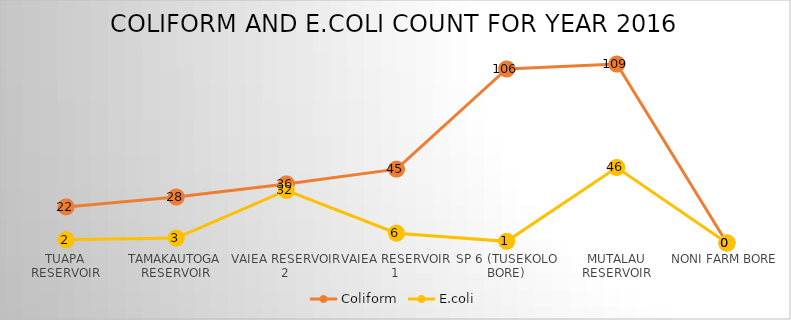
| Category | Coliform | E.coli |
|---|---|---|
| Tuapa Reservoir | 22 | 2 |
| Tamakautoga Reservoir | 28 | 3 |
| Vaiea Reservoir 2 | 36 | 32 |
| Vaiea Reservoir 1 | 45 | 6 |
| SP 6 (Tusekolo Bore) | 106 | 1 |
| Mutalau Reservoir | 109 | 46 |
| Noni Farm Bore | 0 | 0 |